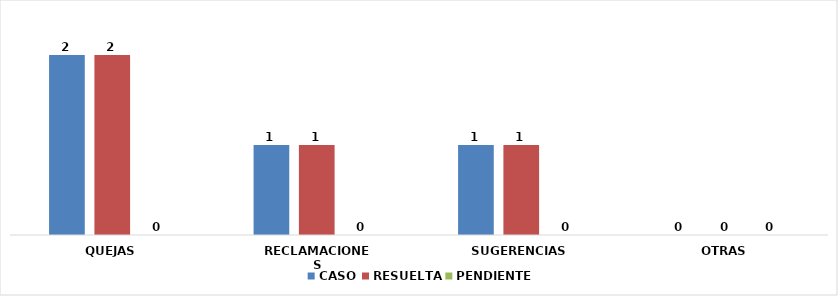
| Category | CASO | RESUELTA | PENDIENTE |
|---|---|---|---|
| QUEJAS | 2 | 2 | 0 |
| RECLAMACIONES | 1 | 1 | 0 |
| SUGERENCIAS | 1 | 1 | 0 |
| OTRAS | 0 | 0 | 0 |